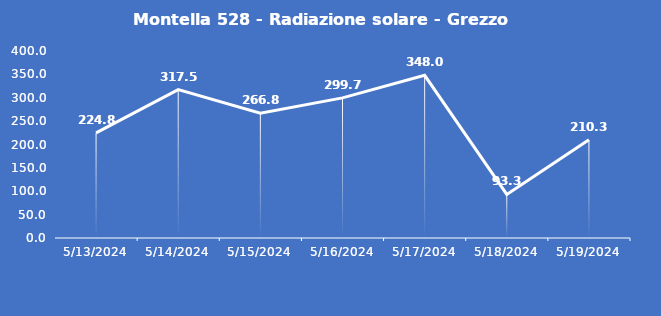
| Category | Montella 528 - Radiazione solare - Grezzo (W/m2) |
|---|---|
| 5/13/24 | 224.8 |
| 5/14/24 | 317.5 |
| 5/15/24 | 266.8 |
| 5/16/24 | 299.7 |
| 5/17/24 | 348 |
| 5/18/24 | 93.3 |
| 5/19/24 | 210.3 |